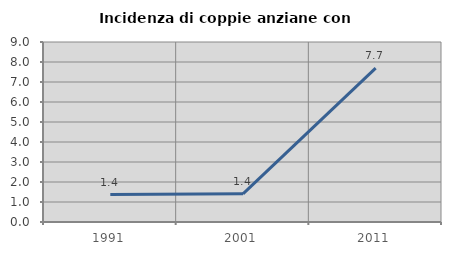
| Category | Incidenza di coppie anziane con figli |
|---|---|
| 1991.0 | 1.37 |
| 2001.0 | 1.408 |
| 2011.0 | 7.692 |